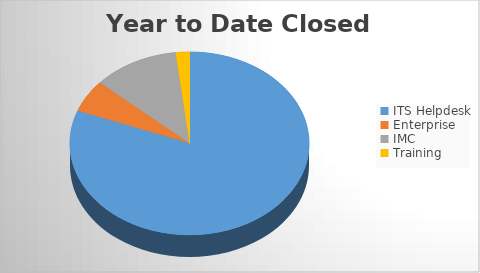
| Category | YTD Closed Tickets | 6M Opened |
|---|---|---|
| ITS Helpdesk | 1433 | 1521 |
| Enterprise | 101 | 120 |
| IMC | 206 | 237 |
| Training | 33 | 49 |